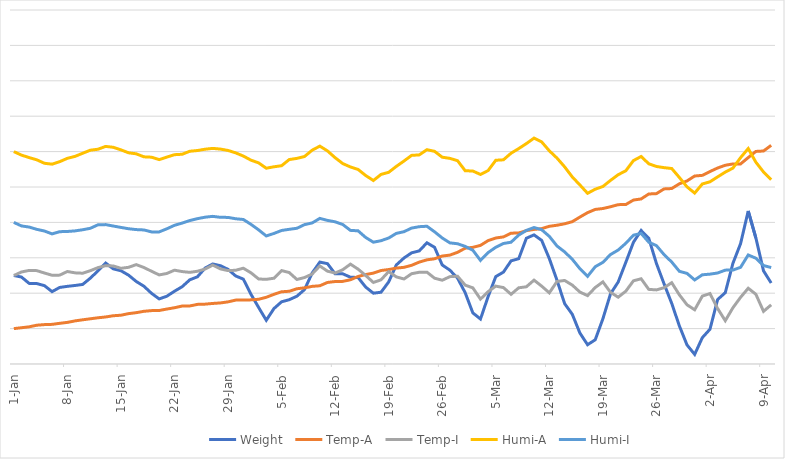
| Category | Weight | Temp-A | Temp-I | Humi-A | Humi-I |
|---|---|---|---|---|---|
| 2018-01-01 | 0.25 | 0.1 | 0.25 | 0.6 | 0.4 |
| 2018-01-02 | 0.246 | 0.102 | 0.26 | 0.59 | 0.39 |
| 2018-01-03 | 0.228 | 0.105 | 0.264 | 0.583 | 0.387 |
| 2018-01-04 | 0.227 | 0.11 | 0.264 | 0.577 | 0.38 |
| 2018-01-05 | 0.221 | 0.111 | 0.257 | 0.567 | 0.376 |
| 2018-01-06 | 0.204 | 0.112 | 0.251 | 0.565 | 0.368 |
| 2018-01-07 | 0.216 | 0.115 | 0.251 | 0.572 | 0.374 |
| 2018-01-08 | 0.219 | 0.118 | 0.261 | 0.581 | 0.374 |
| 2018-01-09 | 0.222 | 0.122 | 0.257 | 0.587 | 0.376 |
| 2018-01-10 | 0.225 | 0.125 | 0.256 | 0.595 | 0.379 |
| 2018-01-11 | 0.243 | 0.128 | 0.264 | 0.604 | 0.383 |
| 2018-01-12 | 0.263 | 0.131 | 0.272 | 0.607 | 0.393 |
| 2018-01-13 | 0.285 | 0.133 | 0.278 | 0.615 | 0.394 |
| 2018-01-14 | 0.269 | 0.136 | 0.277 | 0.612 | 0.39 |
| 2018-01-15 | 0.263 | 0.138 | 0.27 | 0.605 | 0.386 |
| 2018-01-16 | 0.251 | 0.142 | 0.273 | 0.597 | 0.382 |
| 2018-01-17 | 0.233 | 0.145 | 0.281 | 0.594 | 0.38 |
| 2018-01-18 | 0.22 | 0.149 | 0.273 | 0.585 | 0.379 |
| 2018-01-19 | 0.2 | 0.151 | 0.262 | 0.584 | 0.373 |
| 2018-01-20 | 0.184 | 0.151 | 0.252 | 0.577 | 0.373 |
| 2018-01-21 | 0.191 | 0.155 | 0.256 | 0.584 | 0.382 |
| 2018-01-22 | 0.206 | 0.159 | 0.265 | 0.591 | 0.392 |
| 2018-01-23 | 0.218 | 0.164 | 0.261 | 0.592 | 0.398 |
| 2018-01-24 | 0.238 | 0.164 | 0.259 | 0.601 | 0.405 |
| 2018-01-25 | 0.246 | 0.168 | 0.262 | 0.603 | 0.411 |
| 2018-01-26 | 0.271 | 0.169 | 0.268 | 0.607 | 0.415 |
| 2018-01-27 | 0.283 | 0.171 | 0.279 | 0.609 | 0.417 |
| 2018-01-28 | 0.278 | 0.173 | 0.269 | 0.607 | 0.414 |
| 2018-01-29 | 0.267 | 0.176 | 0.264 | 0.603 | 0.414 |
| 2018-01-30 | 0.249 | 0.18 | 0.265 | 0.596 | 0.41 |
| 2018-01-31 | 0.24 | 0.181 | 0.271 | 0.587 | 0.408 |
| 2018-02-01 | 0.197 | 0.181 | 0.258 | 0.576 | 0.394 |
| 2018-02-02 | 0.16 | 0.183 | 0.24 | 0.568 | 0.379 |
| 2018-02-03 | 0.124 | 0.188 | 0.239 | 0.553 | 0.362 |
| 2018-02-04 | 0.157 | 0.197 | 0.242 | 0.557 | 0.369 |
| 2018-02-05 | 0.176 | 0.204 | 0.264 | 0.56 | 0.377 |
| 2018-02-06 | 0.182 | 0.205 | 0.258 | 0.578 | 0.38 |
| 2018-02-07 | 0.191 | 0.213 | 0.239 | 0.581 | 0.383 |
| 2018-02-08 | 0.21 | 0.215 | 0.244 | 0.586 | 0.394 |
| 2018-02-09 | 0.257 | 0.219 | 0.254 | 0.604 | 0.398 |
| 2018-02-10 | 0.288 | 0.221 | 0.277 | 0.615 | 0.411 |
| 2018-02-11 | 0.283 | 0.23 | 0.262 | 0.602 | 0.406 |
| 2018-02-12 | 0.255 | 0.233 | 0.257 | 0.583 | 0.402 |
| 2018-02-13 | 0.255 | 0.233 | 0.266 | 0.566 | 0.394 |
| 2018-02-14 | 0.245 | 0.238 | 0.282 | 0.557 | 0.377 |
| 2018-02-15 | 0.244 | 0.247 | 0.268 | 0.55 | 0.376 |
| 2018-02-16 | 0.217 | 0.253 | 0.25 | 0.532 | 0.357 |
| 2018-02-17 | 0.2 | 0.257 | 0.23 | 0.518 | 0.344 |
| 2018-02-18 | 0.203 | 0.264 | 0.238 | 0.536 | 0.348 |
| 2018-02-19 | 0.232 | 0.267 | 0.261 | 0.541 | 0.356 |
| 2018-02-20 | 0.28 | 0.271 | 0.246 | 0.558 | 0.369 |
| 2018-02-21 | 0.299 | 0.273 | 0.24 | 0.573 | 0.374 |
| 2018-02-22 | 0.314 | 0.279 | 0.255 | 0.589 | 0.384 |
| 2018-02-23 | 0.32 | 0.288 | 0.259 | 0.591 | 0.388 |
| 2018-02-24 | 0.342 | 0.294 | 0.259 | 0.605 | 0.389 |
| 2018-02-25 | 0.33 | 0.297 | 0.242 | 0.601 | 0.373 |
| 2018-02-26 | 0.28 | 0.305 | 0.237 | 0.584 | 0.356 |
| 2018-02-27 | 0.265 | 0.308 | 0.247 | 0.581 | 0.342 |
| 2018-02-28 | 0.243 | 0.315 | 0.248 | 0.574 | 0.34 |
| 2018-03-01 | 0.201 | 0.327 | 0.223 | 0.546 | 0.332 |
| 2018-03-02 | 0.144 | 0.33 | 0.215 | 0.545 | 0.322 |
| 2018-03-03 | 0.127 | 0.335 | 0.183 | 0.535 | 0.293 |
| 2018-03-04 | 0.19 | 0.349 | 0.204 | 0.546 | 0.315 |
| 2018-03-05 | 0.247 | 0.356 | 0.22 | 0.576 | 0.33 |
| 2018-03-06 | 0.26 | 0.359 | 0.216 | 0.577 | 0.34 |
| 2018-03-07 | 0.291 | 0.37 | 0.197 | 0.595 | 0.344 |
| 2018-03-08 | 0.298 | 0.37 | 0.215 | 0.609 | 0.364 |
| 2018-03-09 | 0.355 | 0.377 | 0.218 | 0.623 | 0.377 |
| 2018-03-10 | 0.365 | 0.38 | 0.237 | 0.638 | 0.385 |
| 2018-03-11 | 0.349 | 0.382 | 0.22 | 0.627 | 0.379 |
| 2018-03-12 | 0.298 | 0.389 | 0.201 | 0.602 | 0.361 |
| 2018-03-13 | 0.237 | 0.392 | 0.233 | 0.582 | 0.333 |
| 2018-03-14 | 0.171 | 0.396 | 0.236 | 0.557 | 0.317 |
| 2018-03-15 | 0.141 | 0.402 | 0.223 | 0.528 | 0.296 |
| 2018-03-16 | 0.087 | 0.415 | 0.203 | 0.506 | 0.269 |
| 2018-03-17 | 0.054 | 0.428 | 0.193 | 0.482 | 0.248 |
| 2018-03-18 | 0.068 | 0.437 | 0.216 | 0.494 | 0.275 |
| 2018-03-19 | 0.128 | 0.439 | 0.232 | 0.501 | 0.287 |
| 2018-03-20 | 0.198 | 0.444 | 0.202 | 0.519 | 0.309 |
| 2018-03-21 | 0.232 | 0.45 | 0.189 | 0.535 | 0.322 |
| 2018-03-22 | 0.287 | 0.451 | 0.206 | 0.546 | 0.341 |
| 2018-03-23 | 0.344 | 0.463 | 0.235 | 0.575 | 0.364 |
| 2018-03-24 | 0.377 | 0.466 | 0.241 | 0.586 | 0.369 |
| 2018-03-25 | 0.355 | 0.48 | 0.211 | 0.566 | 0.344 |
| 2018-03-26 | 0.284 | 0.481 | 0.209 | 0.558 | 0.334 |
| 2018-03-27 | 0.226 | 0.495 | 0.215 | 0.555 | 0.309 |
| 2018-03-28 | 0.171 | 0.496 | 0.23 | 0.552 | 0.288 |
| 2018-03-29 | 0.108 | 0.509 | 0.195 | 0.527 | 0.262 |
| 2018-03-30 | 0.054 | 0.517 | 0.167 | 0.5 | 0.256 |
| 2018-03-31 | 0.027 | 0.531 | 0.153 | 0.483 | 0.237 |
| 2018-04-01 | 0.074 | 0.533 | 0.192 | 0.509 | 0.252 |
| 2018-04-02 | 0.098 | 0.544 | 0.199 | 0.515 | 0.254 |
| 2018-04-03 | 0.182 | 0.554 | 0.157 | 0.529 | 0.257 |
| 2018-04-04 | 0.202 | 0.561 | 0.122 | 0.542 | 0.265 |
| 2018-04-05 | 0.284 | 0.565 | 0.159 | 0.553 | 0.265 |
| 2018-04-06 | 0.34 | 0.565 | 0.188 | 0.583 | 0.273 |
| 2018-04-07 | 0.432 | 0.583 | 0.214 | 0.609 | 0.308 |
| 2018-04-08 | 0.356 | 0.6 | 0.197 | 0.57 | 0.299 |
| 2018-04-09 | 0.263 | 0.602 | 0.149 | 0.542 | 0.278 |
| 2018-04-10 | 0.229 | 0.618 | 0.167 | 0.521 | 0.272 |